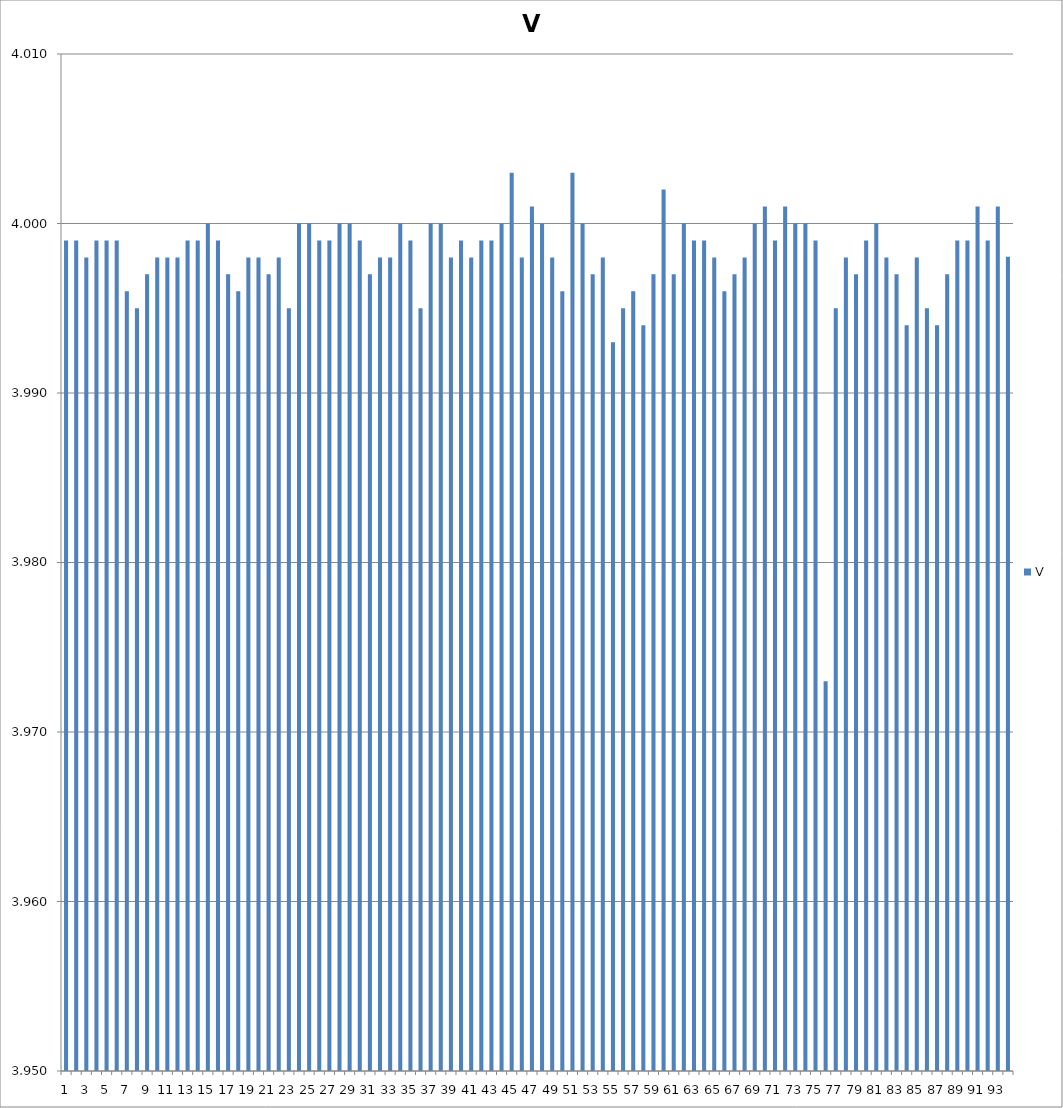
| Category | V |
|---|---|
| 0 | 3.999 |
| 1 | 3.999 |
| 2 | 3.998 |
| 3 | 3.999 |
| 4 | 3.999 |
| 5 | 3.999 |
| 6 | 3.996 |
| 7 | 3.995 |
| 8 | 3.997 |
| 9 | 3.998 |
| 10 | 3.998 |
| 11 | 3.998 |
| 12 | 3.999 |
| 13 | 3.999 |
| 14 | 4 |
| 15 | 3.999 |
| 16 | 3.997 |
| 17 | 3.996 |
| 18 | 3.998 |
| 19 | 3.998 |
| 20 | 3.997 |
| 21 | 3.998 |
| 22 | 3.995 |
| 23 | 4 |
| 24 | 4 |
| 25 | 3.999 |
| 26 | 3.999 |
| 27 | 4 |
| 28 | 4 |
| 29 | 3.999 |
| 30 | 3.997 |
| 31 | 3.998 |
| 32 | 3.998 |
| 33 | 4 |
| 34 | 3.999 |
| 35 | 3.995 |
| 36 | 4 |
| 37 | 4 |
| 38 | 3.998 |
| 39 | 3.999 |
| 40 | 3.998 |
| 41 | 3.999 |
| 42 | 3.999 |
| 43 | 4 |
| 44 | 4.003 |
| 45 | 3.998 |
| 46 | 4.001 |
| 47 | 4 |
| 48 | 3.998 |
| 49 | 3.996 |
| 50 | 4.003 |
| 51 | 4 |
| 52 | 3.997 |
| 53 | 3.998 |
| 54 | 3.993 |
| 55 | 3.995 |
| 56 | 3.996 |
| 57 | 3.994 |
| 58 | 3.997 |
| 59 | 4.002 |
| 60 | 3.997 |
| 61 | 4 |
| 62 | 3.999 |
| 63 | 3.999 |
| 64 | 3.998 |
| 65 | 3.996 |
| 66 | 3.997 |
| 67 | 3.998 |
| 68 | 4 |
| 69 | 4.001 |
| 70 | 3.999 |
| 71 | 4.001 |
| 72 | 4 |
| 73 | 4 |
| 74 | 3.999 |
| 75 | 3.973 |
| 76 | 3.995 |
| 77 | 3.998 |
| 78 | 3.997 |
| 79 | 3.999 |
| 80 | 4 |
| 81 | 3.998 |
| 82 | 3.997 |
| 83 | 3.994 |
| 84 | 3.998 |
| 85 | 3.995 |
| 86 | 3.994 |
| 87 | 3.997 |
| 88 | 3.999 |
| 89 | 3.999 |
| 90 | 4.001 |
| 91 | 3.999 |
| 92 | 4.001 |
| 93 | 3.998 |